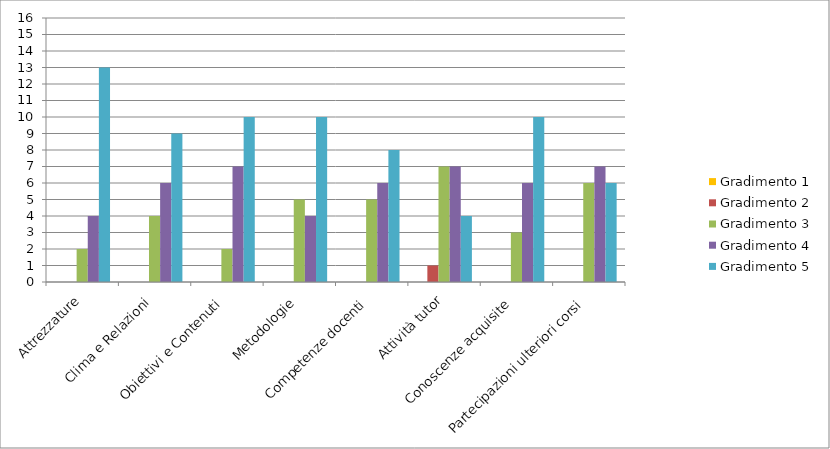
| Category | Gradimento 1 | Gradimento 2 | Gradimento 3 | Gradimento 4 | Gradimento 5 |
|---|---|---|---|---|---|
| Attrezzature | 0 | 0 | 2 | 4 | 13 |
| Clima e Relazioni  | 0 | 0 | 4 | 6 | 9 |
| Obiettivi e Contenuti | 0 | 0 | 2 | 7 | 10 |
| Metodologie | 0 | 0 | 5 | 4 | 10 |
| Competenze docenti | 0 | 0 | 5 | 6 | 8 |
| Attività tutor | 0 | 1 | 7 | 7 | 4 |
| Conoscenze acquisite | 0 | 0 | 3 | 6 | 10 |
| Partecipazioni ulteriori corsi | 0 | 0 | 6 | 7 | 6 |